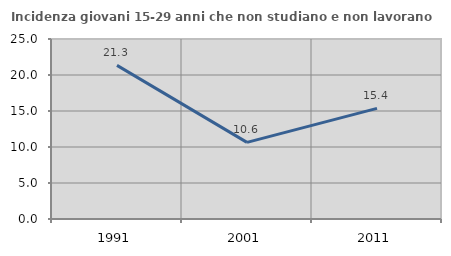
| Category | Incidenza giovani 15-29 anni che non studiano e non lavorano  |
|---|---|
| 1991.0 | 21.333 |
| 2001.0 | 10.641 |
| 2011.0 | 15.369 |